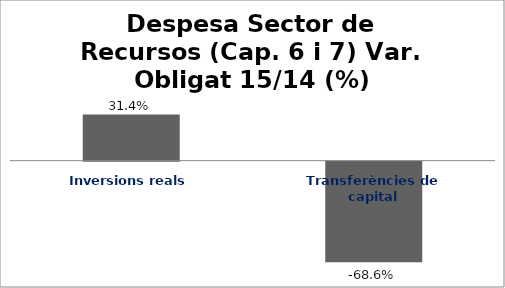
| Category | Series 0 |
|---|---|
| Inversions reals | 0.314 |
| Transferències de capital | -0.686 |